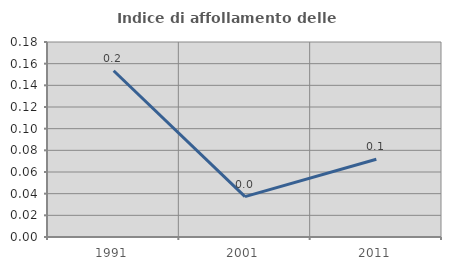
| Category | Indice di affollamento delle abitazioni  |
|---|---|
| 1991.0 | 0.153 |
| 2001.0 | 0.037 |
| 2011.0 | 0.072 |